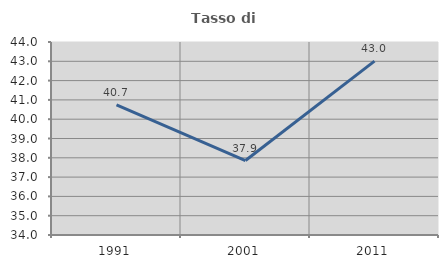
| Category | Tasso di occupazione   |
|---|---|
| 1991.0 | 40.741 |
| 2001.0 | 37.86 |
| 2011.0 | 43.011 |